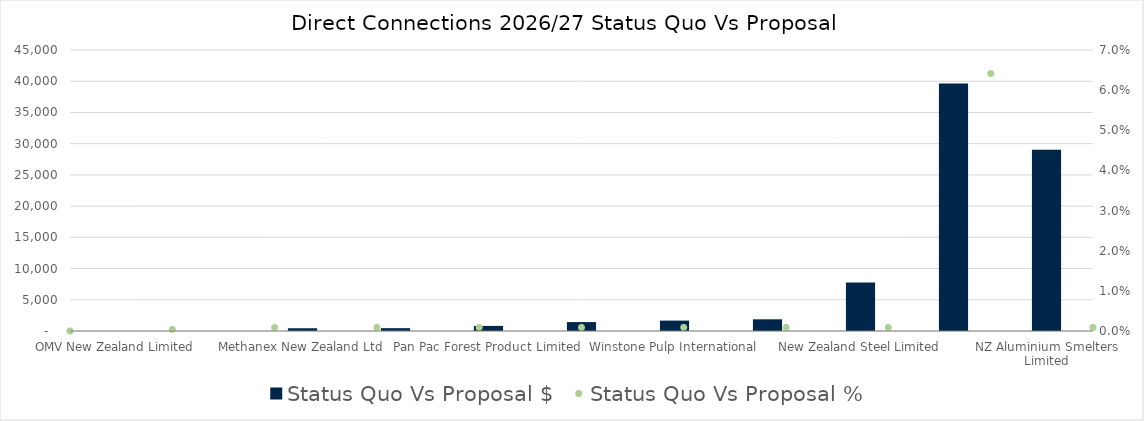
| Category | Status Quo Vs Proposal $ |
|---|---|
| OMV New Zealand Limited | 0 |
| Southpark Utilities Limited | 3.881 |
| Methanex New Zealand Ltd | 441.878 |
| Daiken Southland Limited | 452.877 |
| Pan Pac Forest Product Limited | 815.086 |
| Whareroa Cogeneration Limited | 1426.834 |
| Winstone Pulp International | 1666.614 |
| KiwiRail Holdings Limited | 1871.426 |
| New Zealand Steel Limited | 7758.159 |
| Beach Energy Resources NZ (Holdings) Ltd | 39633.657 |
| NZ Aluminium Smelters Limited | 29032.532 |